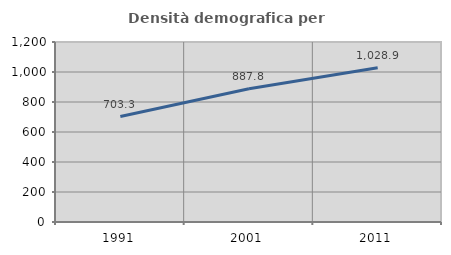
| Category | Densità demografica |
|---|---|
| 1991.0 | 703.32 |
| 2001.0 | 887.815 |
| 2011.0 | 1028.931 |